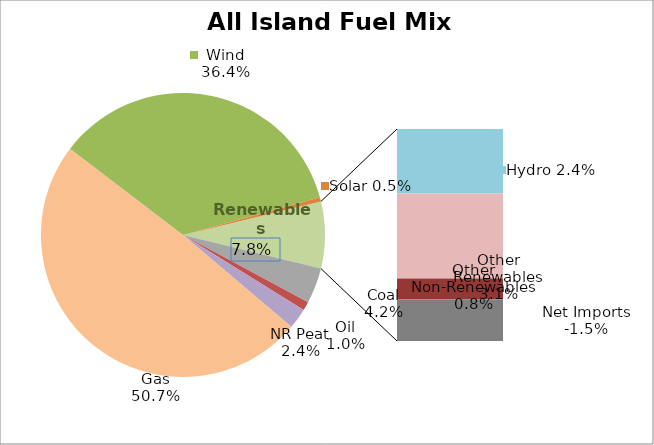
| Category | Series 0 |
|---|---|
| Coal | 0.042 |
| Oil | 0.01 |
| NR Peat | 0.024 |
| Gas | 0.507 |
| Wind | 0.364 |
| Solar | 0.005 |
| Hydro | 0.024 |
| Other Renewables | 0.031 |
| Other Non-Renewables | 0.008 |
| Net Imports | -0.015 |